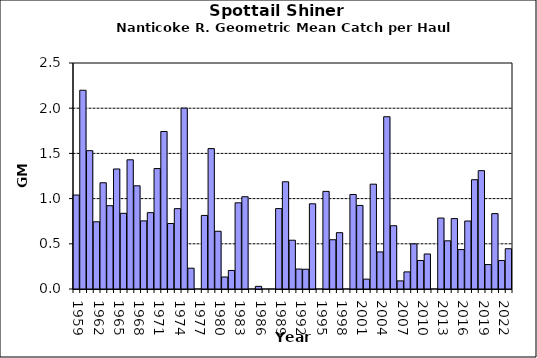
| Category | Series 0 |
|---|---|
| 1959.0 | 1.04 |
| 1960.0 | 2.199 |
| 1961.0 | 1.53 |
| 1962.0 | 0.744 |
| 1963.0 | 1.175 |
| 1964.0 | 0.921 |
| 1965.0 | 1.328 |
| 1966.0 | 0.837 |
| 1967.0 | 1.429 |
| 1968.0 | 1.142 |
| 1969.0 | 0.754 |
| 1970.0 | 0.844 |
| 1971.0 | 1.332 |
| 1972.0 | 1.742 |
| 1973.0 | 0.724 |
| 1974.0 | 0.889 |
| 1975.0 | 2.001 |
| 1976.0 | 0.23 |
| 1977.0 | 0 |
| 1978.0 | 0.814 |
| 1979.0 | 1.553 |
| 1980.0 | 0.639 |
| 1981.0 | 0.133 |
| 1982.0 | 0.205 |
| 1983.0 | 0.953 |
| 1984.0 | 1.021 |
| 1985.0 | 0 |
| 1986.0 | 0.029 |
| 1987.0 | 0 |
| 1988.0 | 0 |
| 1989.0 | 0.89 |
| 1990.0 | 1.186 |
| 1991.0 | 0.54 |
| 1992.0 | 0.221 |
| 1993.0 | 0.219 |
| 1994.0 | 0.943 |
| 1995.0 | 0 |
| 1996.0 | 1.08 |
| 1997.0 | 0.545 |
| 1998.0 | 0.623 |
| 1999.0 | 0 |
| 2000.0 | 1.045 |
| 2001.0 | 0.924 |
| 2002.0 | 0.109 |
| 2003.0 | 1.16 |
| 2004.0 | 0.41 |
| 2005.0 | 1.906 |
| 2006.0 | 0.7 |
| 2007.0 | 0.09 |
| 2008.0 | 0.189 |
| 2009.0 | 0.499 |
| 2010.0 | 0.315 |
| 2011.0 | 0.388 |
| 2012.0 | 0 |
| 2013.0 | 0.785 |
| 2014.0 | 0.533 |
| 2015.0 | 0.779 |
| 2016.0 | 0.436 |
| 2017.0 | 0.752 |
| 2018.0 | 1.209 |
| 2019.0 | 1.309 |
| 2020.0 | 0.27 |
| 2021.0 | 0.834 |
| 2022.0 | 0.315 |
| 2023.0 | 0.445 |